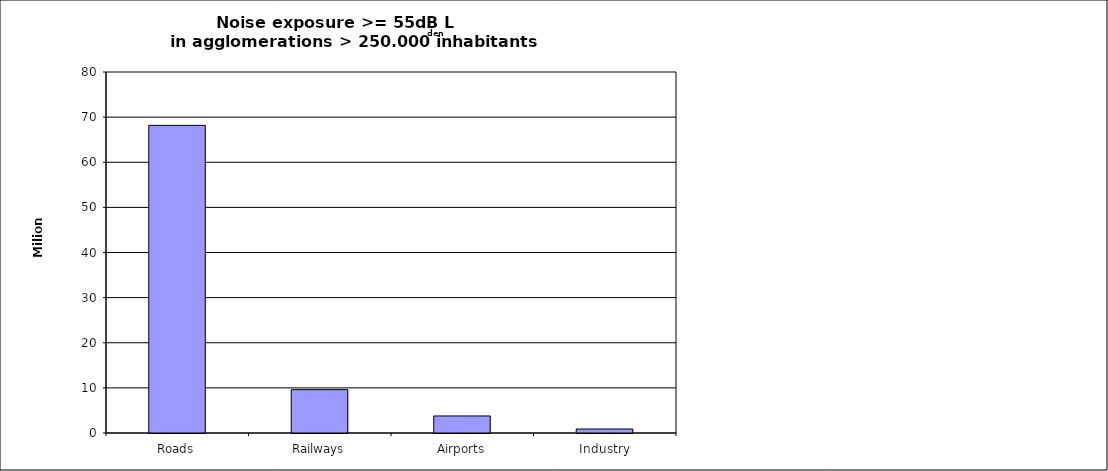
| Category | Series 0 |
|---|---|
| Roads | 68173030 |
| Railways | 9607100 |
| Airports | 3775300 |
| Industry | 884600 |